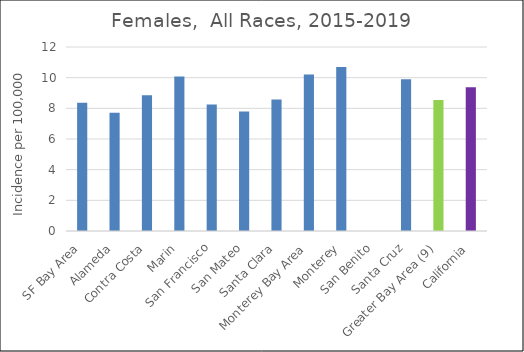
| Category | Female |
|---|---|
| SF Bay Area | 8.36 |
|   Alameda | 7.71 |
|   Contra Costa | 8.85 |
|   Marin | 10.07 |
|   San Francisco | 8.25 |
|   San Mateo | 7.8 |
|   Santa Clara | 8.57 |
| Monterey Bay Area | 10.2 |
|   Monterey | 10.7 |
|   San Benito | 0 |
|   Santa Cruz | 9.89 |
| Greater Bay Area (9) | 8.55 |
| California | 9.37 |